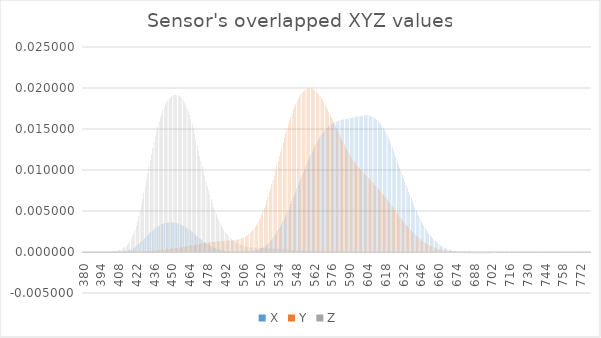
| Category | X | Y | Z |
|---|---|---|---|
| 380.0 | 0 | 0 | 0 |
| 381.0 | 0 | 0 | 0 |
| 382.0 | 0 | 0 | 0 |
| 383.0 | 0 | 0 | 0 |
| 384.0 | 0 | 0 | 0 |
| 385.0 | 0 | 0 | 0 |
| 386.0 | 0 | 0 | 0 |
| 387.0 | 0 | 0 | 0 |
| 388.0 | 0 | 0 | 0 |
| 389.0 | 0 | 0 | 0 |
| 390.0 | 0 | 0 | 0 |
| 391.0 | 0 | 0 | 0 |
| 392.0 | 0 | 0 | 0 |
| 393.0 | 0 | 0 | 0 |
| 394.0 | 0 | 0 | 0 |
| 395.0 | 0 | 0 | 0 |
| 396.0 | 0 | 0 | 0 |
| 397.0 | 0 | 0 | 0 |
| 398.0 | 0 | 0 | 0 |
| 399.0 | 0 | 0 | 0 |
| 400.0 | 0 | 0 | 0 |
| 401.0 | 0 | 0 | 0 |
| 402.0 | 0 | 0 | 0 |
| 403.0 | 0 | 0 | 0 |
| 404.0 | 0 | 0 | 0 |
| 405.0 | 0 | 0 | 0 |
| 406.0 | 0 | 0 | 0 |
| 407.0 | 0 | 0 | 0 |
| 408.0 | 0 | 0 | 0 |
| 409.0 | 0 | 0 | 0 |
| 410.0 | 0 | 0 | 0 |
| 411.0 | 0 | 0 | 0 |
| 412.0 | 0 | 0 | 0 |
| 413.0 | 0 | 0 | 0.001 |
| 414.0 | 0 | 0 | 0.001 |
| 415.0 | 0 | 0 | 0.001 |
| 416.0 | 0 | 0 | 0.001 |
| 417.0 | 0 | 0 | 0.001 |
| 418.0 | 0 | 0 | 0.002 |
| 419.0 | 0 | 0 | 0.002 |
| 420.0 | 0 | 0 | 0.002 |
| 421.0 | 0.001 | 0 | 0.003 |
| 422.0 | 0.001 | 0 | 0.003 |
| 423.0 | 0.001 | 0 | 0.004 |
| 424.0 | 0.001 | 0 | 0.004 |
| 425.0 | 0.001 | 0 | 0.005 |
| 426.0 | 0.001 | 0 | 0.006 |
| 427.0 | 0.001 | 0 | 0.006 |
| 428.0 | 0.001 | 0 | 0.007 |
| 429.0 | 0.002 | 0 | 0.008 |
| 430.0 | 0.002 | 0 | 0.009 |
| 431.0 | 0.002 | 0 | 0.01 |
| 432.0 | 0.002 | 0 | 0.01 |
| 433.0 | 0.002 | 0 | 0.011 |
| 434.0 | 0.002 | 0 | 0.012 |
| 435.0 | 0.003 | 0 | 0.013 |
| 436.0 | 0.003 | 0 | 0.013 |
| 437.0 | 0.003 | 0 | 0.014 |
| 438.0 | 0.003 | 0 | 0.015 |
| 439.0 | 0.003 | 0 | 0.015 |
| 440.0 | 0.003 | 0 | 0.016 |
| 441.0 | 0.003 | 0 | 0.016 |
| 442.0 | 0.003 | 0 | 0.017 |
| 443.0 | 0.003 | 0 | 0.017 |
| 444.0 | 0.003 | 0 | 0.018 |
| 445.0 | 0.004 | 0 | 0.018 |
| 446.0 | 0.004 | 0 | 0.018 |
| 447.0 | 0.004 | 0 | 0.019 |
| 448.0 | 0.004 | 0 | 0.019 |
| 449.0 | 0.004 | 0 | 0.019 |
| 450.0 | 0.004 | 0 | 0.019 |
| 451.0 | 0.004 | 0 | 0.019 |
| 452.0 | 0.004 | 0 | 0.019 |
| 453.0 | 0.004 | 0 | 0.019 |
| 454.0 | 0.004 | 0.001 | 0.019 |
| 455.0 | 0.003 | 0.001 | 0.019 |
| 456.0 | 0.003 | 0.001 | 0.019 |
| 457.0 | 0.003 | 0.001 | 0.019 |
| 458.0 | 0.003 | 0.001 | 0.019 |
| 459.0 | 0.003 | 0.001 | 0.018 |
| 460.0 | 0.003 | 0.001 | 0.018 |
| 461.0 | 0.003 | 0.001 | 0.018 |
| 462.0 | 0.003 | 0.001 | 0.018 |
| 463.0 | 0.003 | 0.001 | 0.017 |
| 464.0 | 0.003 | 0.001 | 0.017 |
| 465.0 | 0.003 | 0.001 | 0.016 |
| 466.0 | 0.003 | 0.001 | 0.016 |
| 467.0 | 0.002 | 0.001 | 0.015 |
| 468.0 | 0.002 | 0.001 | 0.014 |
| 469.0 | 0.002 | 0.001 | 0.014 |
| 470.0 | 0.002 | 0.001 | 0.013 |
| 471.0 | 0.002 | 0.001 | 0.012 |
| 472.0 | 0.002 | 0.001 | 0.012 |
| 473.0 | 0.002 | 0.001 | 0.011 |
| 474.0 | 0.001 | 0.001 | 0.01 |
| 475.0 | 0.001 | 0.001 | 0.01 |
| 476.0 | 0.001 | 0.001 | 0.009 |
| 477.0 | 0.001 | 0.001 | 0.009 |
| 478.0 | 0.001 | 0.001 | 0.008 |
| 479.0 | 0.001 | 0.001 | 0.008 |
| 480.0 | 0.001 | 0.001 | 0.007 |
| 481.0 | 0.001 | 0.001 | 0.006 |
| 482.0 | 0.001 | 0.001 | 0.006 |
| 483.0 | 0.001 | 0.001 | 0.005 |
| 484.0 | 0.001 | 0.001 | 0.005 |
| 485.0 | 0 | 0.001 | 0.005 |
| 486.0 | 0 | 0.001 | 0.004 |
| 487.0 | 0 | 0.001 | 0.004 |
| 488.0 | 0 | 0.001 | 0.004 |
| 489.0 | 0 | 0.001 | 0.003 |
| 490.0 | 0 | 0.001 | 0.003 |
| 491.0 | 0 | 0.001 | 0.003 |
| 492.0 | 0 | 0.001 | 0.002 |
| 493.0 | 0 | 0.001 | 0.002 |
| 494.0 | 0 | 0.001 | 0.002 |
| 495.0 | 0 | 0.001 | 0.002 |
| 496.0 | 0 | 0.001 | 0.002 |
| 497.0 | 0 | 0.001 | 0.002 |
| 498.0 | 0 | 0.001 | 0.001 |
| 499.0 | 0 | 0.001 | 0.001 |
| 500.0 | 0 | 0.001 | 0.001 |
| 501.0 | 0 | 0.001 | 0.001 |
| 502.0 | 0 | 0.002 | 0.001 |
| 503.0 | 0 | 0.002 | 0.001 |
| 504.0 | 0 | 0.002 | 0.001 |
| 505.0 | 0 | 0.002 | 0.001 |
| 506.0 | 0 | 0.002 | 0.001 |
| 507.0 | 0 | 0.002 | 0.001 |
| 508.0 | 0 | 0.002 | 0.001 |
| 509.0 | 0 | 0.002 | 0.001 |
| 510.0 | 0 | 0.002 | 0.001 |
| 511.0 | 0 | 0.002 | 0.001 |
| 512.0 | 0 | 0.002 | 0.001 |
| 513.0 | 0 | 0.002 | 0.001 |
| 514.0 | 0 | 0.003 | 0.001 |
| 515.0 | 0 | 0.003 | 0.001 |
| 516.0 | 0 | 0.003 | 0.001 |
| 517.0 | 0 | 0.003 | 0 |
| 518.0 | 0 | 0.004 | 0 |
| 519.0 | 0 | 0.004 | 0 |
| 520.0 | 0 | 0.004 | 0 |
| 521.0 | 0 | 0.005 | 0 |
| 522.0 | 0.001 | 0.005 | 0 |
| 523.0 | 0.001 | 0.005 | 0 |
| 524.0 | 0.001 | 0.006 | 0 |
| 525.0 | 0.001 | 0.006 | 0 |
| 526.0 | 0.001 | 0.007 | 0 |
| 527.0 | 0.001 | 0.007 | 0 |
| 528.0 | 0.001 | 0.008 | 0 |
| 529.0 | 0.001 | 0.008 | 0 |
| 530.0 | 0.002 | 0.009 | 0 |
| 531.0 | 0.002 | 0.009 | 0 |
| 532.0 | 0.002 | 0.01 | 0 |
| 533.0 | 0.002 | 0.011 | 0 |
| 534.0 | 0.003 | 0.011 | 0 |
| 535.0 | 0.003 | 0.012 | 0 |
| 536.0 | 0.003 | 0.012 | 0 |
| 537.0 | 0.003 | 0.013 | 0 |
| 538.0 | 0.004 | 0.013 | 0 |
| 539.0 | 0.004 | 0.014 | 0 |
| 540.0 | 0.004 | 0.015 | 0 |
| 541.0 | 0.005 | 0.015 | 0 |
| 542.0 | 0.005 | 0.016 | 0 |
| 543.0 | 0.005 | 0.016 | 0 |
| 544.0 | 0.006 | 0.016 | 0 |
| 545.0 | 0.006 | 0.017 | 0 |
| 546.0 | 0.007 | 0.017 | 0 |
| 547.0 | 0.007 | 0.018 | 0 |
| 548.0 | 0.007 | 0.018 | 0 |
| 549.0 | 0.008 | 0.018 | 0 |
| 550.0 | 0.008 | 0.019 | 0 |
| 551.0 | 0.009 | 0.019 | 0 |
| 552.0 | 0.009 | 0.019 | 0 |
| 553.0 | 0.009 | 0.019 | 0 |
| 554.0 | 0.01 | 0.02 | 0 |
| 555.0 | 0.01 | 0.02 | 0 |
| 556.0 | 0.01 | 0.02 | 0 |
| 557.0 | 0.011 | 0.02 | 0 |
| 558.0 | 0.011 | 0.02 | 0 |
| 559.0 | 0.012 | 0.02 | 0 |
| 560.0 | 0.012 | 0.02 | 0 |
| 561.0 | 0.012 | 0.02 | 0 |
| 562.0 | 0.013 | 0.02 | 0 |
| 563.0 | 0.013 | 0.02 | 0 |
| 564.0 | 0.013 | 0.02 | 0 |
| 565.0 | 0.013 | 0.019 | 0 |
| 566.0 | 0.014 | 0.019 | 0 |
| 567.0 | 0.014 | 0.019 | 0 |
| 568.0 | 0.014 | 0.019 | 0 |
| 569.0 | 0.014 | 0.019 | 0 |
| 570.0 | 0.015 | 0.018 | 0 |
| 571.0 | 0.015 | 0.018 | 0 |
| 572.0 | 0.015 | 0.018 | 0 |
| 573.0 | 0.015 | 0.017 | 0 |
| 574.0 | 0.015 | 0.017 | 0 |
| 575.0 | 0.015 | 0.017 | 0 |
| 576.0 | 0.016 | 0.016 | 0 |
| 577.0 | 0.016 | 0.016 | 0 |
| 578.0 | 0.016 | 0.016 | 0 |
| 579.0 | 0.016 | 0.015 | 0 |
| 580.0 | 0.016 | 0.015 | 0 |
| 581.0 | 0.016 | 0.015 | 0 |
| 582.0 | 0.016 | 0.014 | 0 |
| 583.0 | 0.016 | 0.014 | 0 |
| 584.0 | 0.016 | 0.014 | 0 |
| 585.0 | 0.016 | 0.013 | 0 |
| 586.0 | 0.016 | 0.013 | 0 |
| 587.0 | 0.016 | 0.013 | 0 |
| 588.0 | 0.016 | 0.013 | 0 |
| 589.0 | 0.016 | 0.012 | 0 |
| 590.0 | 0.016 | 0.012 | 0 |
| 591.0 | 0.016 | 0.012 | 0 |
| 592.0 | 0.016 | 0.012 | 0 |
| 593.0 | 0.016 | 0.011 | 0 |
| 594.0 | 0.016 | 0.011 | 0 |
| 595.0 | 0.016 | 0.011 | 0 |
| 596.0 | 0.017 | 0.011 | 0 |
| 597.0 | 0.017 | 0.01 | 0 |
| 598.0 | 0.017 | 0.01 | 0 |
| 599.0 | 0.017 | 0.01 | 0 |
| 600.0 | 0.017 | 0.01 | 0 |
| 601.0 | 0.017 | 0.01 | 0 |
| 602.0 | 0.017 | 0.01 | 0 |
| 603.0 | 0.017 | 0.009 | 0 |
| 604.0 | 0.017 | 0.009 | 0 |
| 605.0 | 0.017 | 0.009 | 0 |
| 606.0 | 0.017 | 0.009 | 0 |
| 607.0 | 0.017 | 0.009 | 0 |
| 608.0 | 0.017 | 0.009 | 0 |
| 609.0 | 0.016 | 0.008 | 0 |
| 610.0 | 0.016 | 0.008 | 0 |
| 611.0 | 0.016 | 0.008 | 0 |
| 612.0 | 0.016 | 0.008 | 0 |
| 613.0 | 0.016 | 0.008 | 0 |
| 614.0 | 0.016 | 0.008 | 0 |
| 615.0 | 0.016 | 0.007 | 0 |
| 616.0 | 0.015 | 0.007 | 0 |
| 617.0 | 0.015 | 0.007 | 0 |
| 618.0 | 0.015 | 0.007 | 0 |
| 619.0 | 0.015 | 0.007 | 0 |
| 620.0 | 0.014 | 0.006 | 0 |
| 621.0 | 0.014 | 0.006 | 0 |
| 622.0 | 0.014 | 0.006 | 0 |
| 623.0 | 0.013 | 0.006 | 0 |
| 624.0 | 0.013 | 0.006 | 0 |
| 625.0 | 0.012 | 0.005 | 0 |
| 626.0 | 0.012 | 0.005 | 0 |
| 627.0 | 0.012 | 0.005 | 0 |
| 628.0 | 0.011 | 0.005 | 0 |
| 629.0 | 0.011 | 0.004 | 0 |
| 630.0 | 0.01 | 0.004 | 0 |
| 631.0 | 0.01 | 0.004 | 0 |
| 632.0 | 0.009 | 0.004 | 0 |
| 633.0 | 0.009 | 0.004 | 0 |
| 634.0 | 0.009 | 0.003 | 0 |
| 635.0 | 0.008 | 0.003 | 0 |
| 636.0 | 0.008 | 0.003 | 0 |
| 637.0 | 0.007 | 0.003 | 0 |
| 638.0 | 0.007 | 0.003 | 0 |
| 639.0 | 0.007 | 0.003 | 0 |
| 640.0 | 0.006 | 0.002 | 0 |
| 641.0 | 0.006 | 0.002 | 0 |
| 642.0 | 0.005 | 0.002 | 0 |
| 643.0 | 0.005 | 0.002 | 0 |
| 644.0 | 0.005 | 0.002 | 0 |
| 645.0 | 0.004 | 0.002 | 0 |
| 646.0 | 0.004 | 0.002 | 0 |
| 647.0 | 0.004 | 0.001 | 0 |
| 648.0 | 0.003 | 0.001 | 0 |
| 649.0 | 0.003 | 0.001 | 0 |
| 650.0 | 0.003 | 0.001 | 0 |
| 651.0 | 0.003 | 0.001 | 0 |
| 652.0 | 0.002 | 0.001 | 0 |
| 653.0 | 0.002 | 0.001 | 0 |
| 654.0 | 0.002 | 0.001 | 0 |
| 655.0 | 0.002 | 0.001 | 0 |
| 656.0 | 0.002 | 0.001 | 0 |
| 657.0 | 0.001 | 0.001 | 0 |
| 658.0 | 0.001 | 0 | 0 |
| 659.0 | 0.001 | 0 | 0 |
| 660.0 | 0.001 | 0 | 0 |
| 661.0 | 0.001 | 0 | 0 |
| 662.0 | 0.001 | 0 | 0 |
| 663.0 | 0.001 | 0 | 0 |
| 664.0 | 0.001 | 0 | 0 |
| 665.0 | 0.001 | 0 | 0 |
| 666.0 | 0 | 0 | 0 |
| 667.0 | 0 | 0 | 0 |
| 668.0 | 0 | 0 | 0 |
| 669.0 | 0 | 0 | 0 |
| 670.0 | 0 | 0 | 0 |
| 671.0 | 0 | 0 | 0 |
| 672.0 | 0 | 0 | 0 |
| 673.0 | 0 | 0 | 0 |
| 674.0 | 0 | 0 | 0 |
| 675.0 | 0 | 0 | 0 |
| 676.0 | 0 | 0 | 0 |
| 677.0 | 0 | 0 | 0 |
| 678.0 | 0 | 0 | 0 |
| 679.0 | 0 | 0 | 0 |
| 680.0 | 0 | 0 | 0 |
| 681.0 | 0 | 0 | 0 |
| 682.0 | 0 | 0 | 0 |
| 683.0 | 0 | 0 | 0 |
| 684.0 | 0 | 0 | 0 |
| 685.0 | 0 | 0 | 0 |
| 686.0 | 0 | 0 | 0 |
| 687.0 | 0 | 0 | 0 |
| 688.0 | 0 | 0 | 0 |
| 689.0 | 0 | 0 | 0 |
| 690.0 | 0 | 0 | 0 |
| 691.0 | 0 | 0 | 0 |
| 692.0 | 0 | 0 | 0 |
| 693.0 | 0 | 0 | 0 |
| 694.0 | 0 | 0 | 0 |
| 695.0 | 0 | 0 | 0 |
| 696.0 | 0 | 0 | 0 |
| 697.0 | 0 | 0 | 0 |
| 698.0 | 0 | 0 | 0 |
| 699.0 | 0 | 0 | 0 |
| 700.0 | 0 | 0 | 0 |
| 701.0 | 0 | 0 | 0 |
| 702.0 | 0 | 0 | 0 |
| 703.0 | 0 | 0 | 0 |
| 704.0 | 0 | 0 | 0 |
| 705.0 | 0 | 0 | 0 |
| 706.0 | 0 | 0 | 0 |
| 707.0 | 0 | 0 | 0 |
| 708.0 | 0 | 0 | 0 |
| 709.0 | 0 | 0 | 0 |
| 710.0 | 0 | 0 | 0 |
| 711.0 | 0 | 0 | 0 |
| 712.0 | 0 | 0 | 0 |
| 713.0 | 0 | 0 | 0 |
| 714.0 | 0 | 0 | 0 |
| 715.0 | 0 | 0 | 0 |
| 716.0 | 0 | 0 | 0 |
| 717.0 | 0 | 0 | 0 |
| 718.0 | 0 | 0 | 0 |
| 719.0 | 0 | 0 | 0 |
| 720.0 | 0 | 0 | 0 |
| 721.0 | 0 | 0 | 0 |
| 722.0 | 0 | 0 | 0 |
| 723.0 | 0 | 0 | 0 |
| 724.0 | 0 | 0 | 0 |
| 725.0 | 0 | 0 | 0 |
| 726.0 | 0 | 0 | 0 |
| 727.0 | 0 | 0 | 0 |
| 728.0 | 0 | 0 | 0 |
| 729.0 | 0 | 0 | 0 |
| 730.0 | 0 | 0 | 0 |
| 731.0 | 0 | 0 | 0 |
| 732.0 | 0 | 0 | 0 |
| 733.0 | 0 | 0 | 0 |
| 734.0 | 0 | 0 | 0 |
| 735.0 | 0 | 0 | 0 |
| 736.0 | 0 | 0 | 0 |
| 737.0 | 0 | 0 | 0 |
| 738.0 | 0 | 0 | 0 |
| 739.0 | 0 | 0 | 0 |
| 740.0 | 0 | 0 | 0 |
| 741.0 | 0 | 0 | 0 |
| 742.0 | 0 | 0 | 0 |
| 743.0 | 0 | 0 | 0 |
| 744.0 | 0 | 0 | 0 |
| 745.0 | 0 | 0 | 0 |
| 746.0 | 0 | 0 | 0 |
| 747.0 | 0 | 0 | 0 |
| 748.0 | 0 | 0 | 0 |
| 749.0 | 0 | 0 | 0 |
| 750.0 | 0 | 0 | 0 |
| 751.0 | 0 | 0 | 0 |
| 752.0 | 0 | 0 | 0 |
| 753.0 | 0 | 0 | 0 |
| 754.0 | 0 | 0 | 0 |
| 755.0 | 0 | 0 | 0 |
| 756.0 | 0 | 0 | 0 |
| 757.0 | 0 | 0 | 0 |
| 758.0 | 0 | 0 | 0 |
| 759.0 | 0 | 0 | 0 |
| 760.0 | 0 | 0 | 0 |
| 761.0 | 0 | 0 | 0 |
| 762.0 | 0 | 0 | 0 |
| 763.0 | 0 | 0 | 0 |
| 764.0 | 0 | 0 | 0 |
| 765.0 | 0 | 0 | 0 |
| 766.0 | 0 | 0 | 0 |
| 767.0 | 0 | 0 | 0 |
| 768.0 | 0 | 0 | 0 |
| 769.0 | 0 | 0 | 0 |
| 770.0 | 0 | 0 | 0 |
| 771.0 | 0 | 0 | 0 |
| 772.0 | 0 | 0 | 0 |
| 773.0 | 0 | 0 | 0 |
| 774.0 | 0 | 0 | 0 |
| 775.0 | 0 | 0 | 0 |
| 776.0 | 0 | 0 | 0 |
| 777.0 | 0 | 0 | 0 |
| 778.0 | 0 | 0 | 0 |
| 779.0 | 0 | 0 | 0 |
| 780.0 | 0 | 0 | 0 |